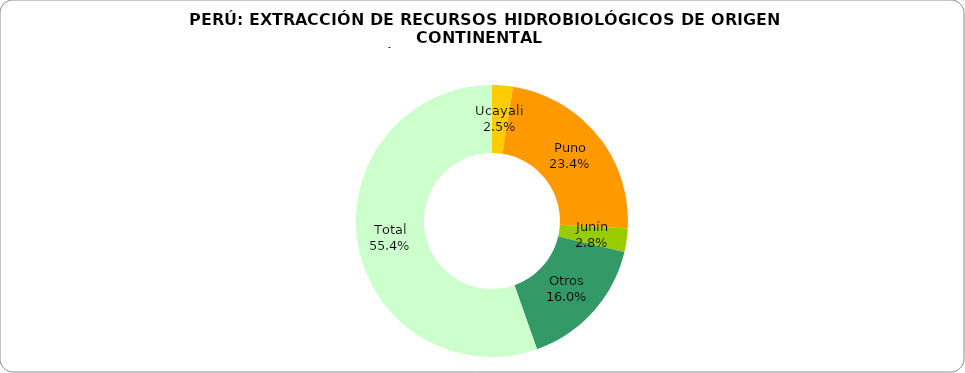
| Category | Series 0 |
|---|---|
| Ucayali | 3466.512 |
| Puno | 32832.517 |
| Junín | 3896.465 |
| Otros | 22377.774 |
| Total | 77618.738 |